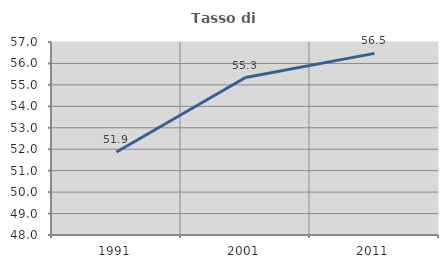
| Category | Tasso di occupazione   |
|---|---|
| 1991.0 | 51.873 |
| 2001.0 | 55.342 |
| 2011.0 | 56.471 |